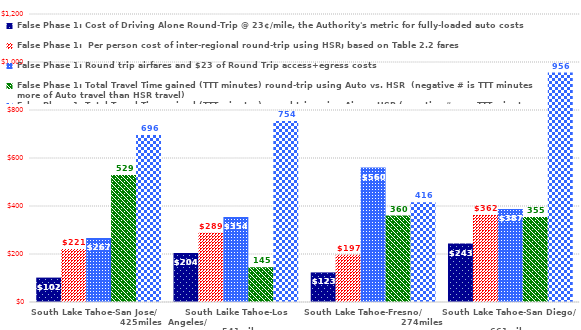
| Category | False Phase 1: Cost of Driving Alone Round-Trip @ 23¢/mile, the Authority's metric for fully-loaded auto costs | False Phase 1:  Per person cost of inter-regional round-trip using HSR; based on Table 2.2 fares | False Phase 1: Round trip airfares and $23 of Round Trip access+egress costs | False Phase 1: Total Travel Time gained (TTT minutes) round-trip using Auto vs. HSR  (negative # is TTT minutes more of Auto travel than HSR travel) | False Phase 1: Total Travel Time gained (TTT minutes) round-trip using Air vs. HSR (negative #s are TTT minutes saved by HSR travelers over Air travelers) |
|---|---|---|---|---|---|
| South Lake Tahoe-San Jose/                               425miles | 101.66 | 221 | 267 | 528.8 | 696 |
| South Laike Tahoe-Los Angeles/                                        541miles | 203.78 | 289 | 354 | 144.9 | 754 |
| South Lake Tahoe-Fresno/                                      274miles | 123.28 | 197 | 560 | 360.1 | 416 |
| South Lake Tahoe-San Diego/                                         661miles | 243.34 | 362 | 387 | 354.5 | 956 |